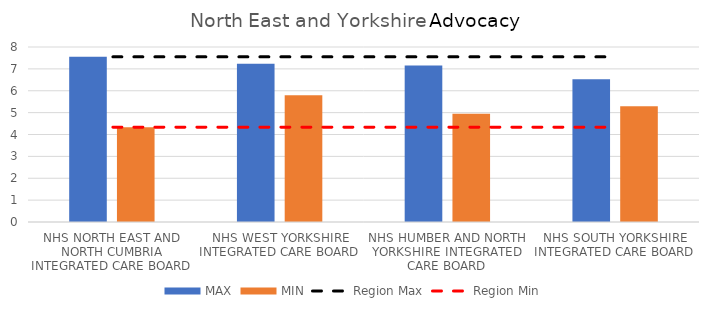
| Category | MAX | MIN |
|---|---|---|
| NHS NORTH EAST AND NORTH CUMBRIA INTEGRATED CARE BOARD | 7.551 | 4.335 |
| NHS WEST YORKSHIRE INTEGRATED CARE BOARD | 7.239 | 5.795 |
| NHS HUMBER AND NORTH YORKSHIRE INTEGRATED CARE BOARD | 7.156 | 4.944 |
| NHS SOUTH YORKSHIRE INTEGRATED CARE BOARD | 6.528 | 5.289 |